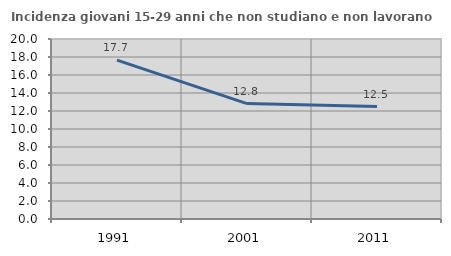
| Category | Incidenza giovani 15-29 anni che non studiano e non lavorano  |
|---|---|
| 1991.0 | 17.653 |
| 2001.0 | 12.821 |
| 2011.0 | 12.5 |